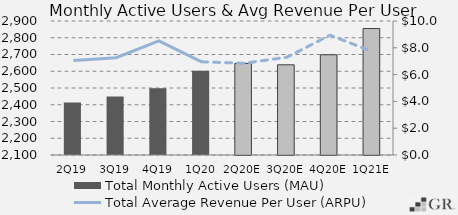
| Category | Total Monthly Active Users (MAU)  |
|---|---|
|  2Q19  | 2414 |
|  3Q19  | 2449 |
|  4Q19  | 2497.8 |
|  1Q20  | 2603 |
|  2Q20E  | 2646.95 |
|  3Q20E  | 2638.468 |
|  4Q20E  | 2698.592 |
|  1Q21E  | 2854.969 |